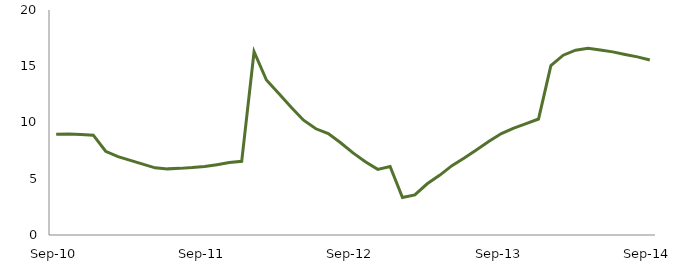
| Category | Series 0 |
|---|---|
| Sep-10 | 8.947 |
|  | 8.982 |
|  | 8.931 |
|  | 8.872 |
|  | 7.441 |
|  | 6.973 |
|  | 6.631 |
|  | 6.295 |
|  | 5.971 |
|  | 5.878 |
|  | 5.922 |
|  | 5.995 |
| Sep-11 | 6.094 |
|  | 6.254 |
|  | 6.435 |
|  | 6.551 |
|  | 16.287 |
|  | 13.779 |
|  | 12.581 |
|  | 11.354 |
|  | 10.206 |
|  | 9.442 |
|  | 9.023 |
|  | 8.202 |
| Sep-12 | 7.302 |
|  | 6.505 |
|  | 5.832 |
|  | 6.087 |
|  | 3.328 |
|  | 3.566 |
|  | 4.552 |
|  | 5.302 |
|  | 6.165 |
|  | 6.838 |
|  | 7.569 |
|  | 8.335 |
| Sep-13 | 9.014 |
|  | 9.5 |
|  | 9.898 |
|  | 10.31 |
|  | 15.062 |
|  | 15.983 |
|  | 16.424 |
|  | 16.607 |
|  | 16.44 |
|  | 16.277 |
|  | 16.048 |
|  | 15.834 |
| Sep-14 | 15.556 |